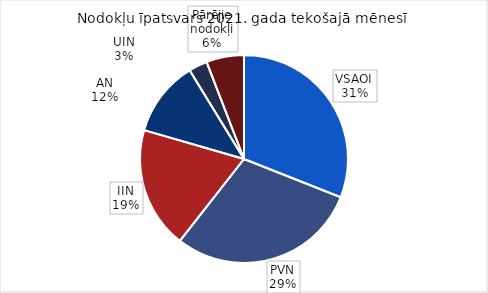
| Category | īpatsvars 2021 |
|---|---|
| VSAOI | 0.31 |
| PVN | 0.296 |
| IIN | 0.189 |
| AN | 0.118 |
| UIN | 0.029 |
| Pārējie nodokļi | 0.059 |